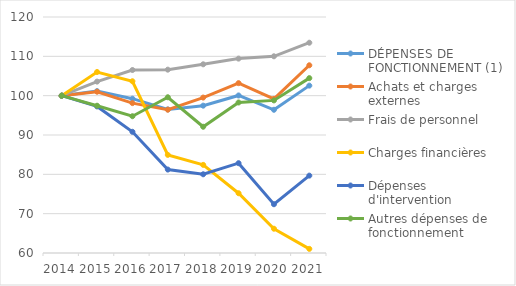
| Category | DÉPENSES DE FONCTIONNEMENT (1) | Achats et charges externes | Frais de personnel | Charges financières | Dépenses d'intervention | Autres dépenses de fonctionnement |
|---|---|---|---|---|---|---|
| 2014.0 | 100 | 100 | 100 | 100 | 100 | 100 |
| 2015.0 | 101.155 | 101.007 | 103.572 | 106.017 | 97.264 | 97.441 |
| 2016.0 | 99.232 | 98.106 | 106.521 | 103.666 | 90.814 | 94.775 |
| 2017.0 | 96.513 | 96.432 | 106.611 | 84.945 | 81.214 | 99.597 |
| 2018.0 | 97.459 | 99.518 | 107.975 | 82.405 | 80.014 | 92.097 |
| 2019.0 | 100.055 | 103.182 | 109.42 | 75.198 | 82.834 | 98.263 |
| 2020.0 | 96.414 | 99.188 | 110.01 | 66.174 | 72.398 | 98.797 |
| 2021.0 | 102.551 | 107.724 | 113.46 | 61.05 | 79.67 | 104.458 |